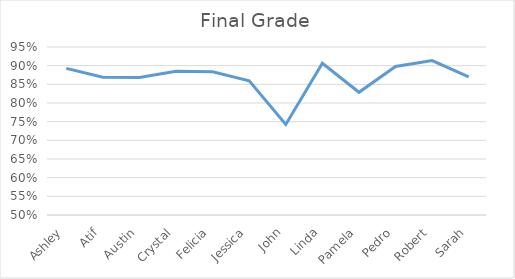
| Category | Final Grade |
|---|---|
| Ashley | 0.893 |
| Atif | 0.869 |
| Austin | 0.868 |
| Crystal | 0.885 |
| Felicia | 0.884 |
| Jessica | 0.86 |
| John | 0.743 |
| Linda | 0.907 |
| Pamela | 0.829 |
| Pedro | 0.898 |
| Robert | 0.914 |
| Sarah | 0.87 |